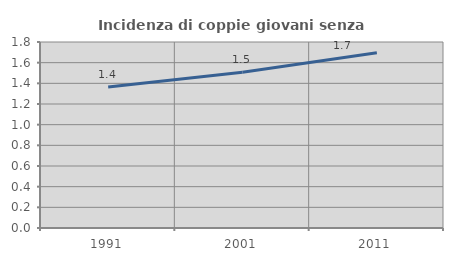
| Category | Incidenza di coppie giovani senza figli |
|---|---|
| 1991.0 | 1.364 |
| 2001.0 | 1.508 |
| 2011.0 | 1.695 |